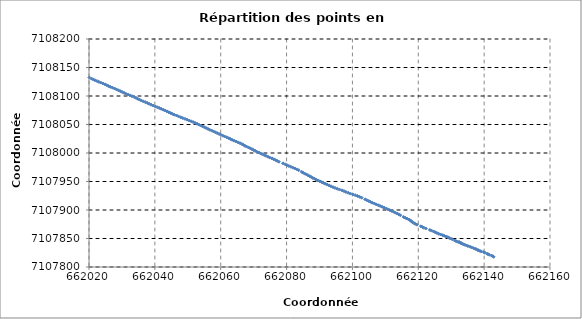
| Category | Series 0 |
|---|---|
| 662142.856 | 7107817.874 |
| 662142.643 | 7107818.833 |
| 662142.29 | 7107819.903 |
| 662141.56 | 7107821.535 |
| 662141.16 | 7107822.547 |
| 662140.993 | 7107823.148 |
| 662140.245 | 7107824.994 |
| 662139.904 | 7107826.148 |
| 662139.126 | 7107827.382 |
| 662138.732 | 7107828.174 |
| 662138.262 | 7107829.174 |
| 662138.087 | 7107829.929 |
| 662137.581 | 7107831.026 |
| 662137.343 | 7107832.045 |
| 662136.74 | 7107833.074 |
| 662136.164 | 7107834.523 |
| 662135.696 | 7107835.626 |
| 662135.075 | 7107836.66 |
| 662134.655 | 7107837.752 |
| 662134.19 | 7107838.871 |
| 662133.732 | 7107839.896 |
| 662133.374 | 7107840.718 |
| 662133.049 | 7107841.609 |
| 662132.857 | 7107842.396 |
| 662132.733 | 7107842.859 |
| 662132.731 | 7107842.962 |
| 662132.418 | 7107843.529 |
| 662132.406 | 7107843.818 |
| 662131.921 | 7107844.379 |
| 662131.429 | 7107845.415 |
| 662131.043 | 7107846.538 |
| 662130.292 | 7107848.714 |
| 662129.821 | 7107849.905 |
| 662129.376 | 7107851.09 |
| 662128.97 | 7107852.319 |
| 662128.477 | 7107853.493 |
| 662127.912 | 7107854.671 |
| 662127.365 | 7107855.824 |
| 662126.78 | 7107857.063 |
| 662126.212 | 7107858.311 |
| 662125.649 | 7107859.601 |
| 662125.13 | 7107860.944 |
| 662124.645 | 7107862.298 |
| 662124.035 | 7107863.785 |
| 662123.491 | 7107865.133 |
| 662122.301 | 7107867.668 |
| 662121.714 | 7107868.803 |
| 662121.287 | 7107870.15 |
| 662120.759 | 7107871.486 |
| 662119.591 | 7107874.235 |
| 662119.059 | 7107875.676 |
| 662118.64 | 7107877.208 |
| 662118.204 | 7107878.703 |
| 662117.867 | 7107880.279 |
| 662117.552 | 7107881.8 |
| 662117.163 | 7107883.282 |
| 662116.613 | 7107884.838 |
| 662116.075 | 7107886.239 |
| 662115.54 | 7107887.72 |
| 662114.552 | 7107890.746 |
| 662114.077 | 7107892.261 |
| 662113.603 | 7107893.788 |
| 662113.045 | 7107895.338 |
| 662112.48 | 7107896.89 |
| 662111.885 | 7107898.384 |
| 662111.316 | 7107899.841 |
| 662110.748 | 7107901.295 |
| 662110.133 | 7107902.759 |
| 662109.619 | 7107904.177 |
| 662109.061 | 7107905.61 |
| 662108.427 | 7107906.959 |
| 662107.852 | 7107908.361 |
| 662107.201 | 7107909.865 |
| 662106.657 | 7107911.343 |
| 662106.043 | 7107912.808 |
| 662105.518 | 7107914.251 |
| 662104.946 | 7107915.747 |
| 662104.384 | 7107917.213 |
| 662103.859 | 7107918.715 |
| 662102.808 | 7107921.612 |
| 662102.183 | 7107923.055 |
| 662101.546 | 7107924.57 |
| 662100.837 | 7107926.011 |
| 662100.113 | 7107927.289 |
| 662099.374 | 7107928.732 |
| 662098.694 | 7107930.23 |
| 662098.004 | 7107931.679 |
| 662097.431 | 7107933.125 |
| 662096.834 | 7107934.542 |
| 662096.067 | 7107935.883 |
| 662095.384 | 7107937.268 |
| 662094.695 | 7107938.713 |
| 662094.094 | 7107940.137 |
| 662093.489 | 7107941.579 |
| 662092.924 | 7107943.099 |
| 662092.34 | 7107944.587 |
| 662091.795 | 7107946.079 |
| 662091.206 | 7107947.472 |
| 662090.664 | 7107948.894 |
| 662090.08 | 7107950.391 |
| 662089.499 | 7107951.84 |
| 662089.006 | 7107953.304 |
| 662088.485 | 7107954.854 |
| 662087.931 | 7107956.326 |
| 662087.487 | 7107957.836 |
| 662087.009 | 7107959.321 |
| 662086.514 | 7107960.835 |
| 662086.056 | 7107962.317 |
| 662085.535 | 7107963.801 |
| 662085.043 | 7107965.328 |
| 662084.616 | 7107966.742 |
| 662083.666 | 7107969.735 |
| 662083.216 | 7107971.194 |
| 662082.585 | 7107972.726 |
| 662081.957 | 7107974.198 |
| 662081.316 | 7107975.707 |
| 662080.691 | 7107977.209 |
| 662080.103 | 7107978.761 |
| 662079.557 | 7107980.283 |
| 662078.908 | 7107981.876 |
| 662077.656 | 7107984.717 |
| 662077.15 | 7107986.128 |
| 662076.624 | 7107987.603 |
| 662076.087 | 7107989.081 |
| 662075.531 | 7107990.573 |
| 662074.892 | 7107991.953 |
| 662074.353 | 7107993.469 |
| 662073.744 | 7107995.008 |
| 662073.209 | 7107996.504 |
| 662072.605 | 7107997.925 |
| 662072.106 | 7107999.287 |
| 662071.584 | 7108000.799 |
| 662070.965 | 7108002.302 |
| 662070.452 | 7108003.749 |
| 662069.98 | 7108005.213 |
| 662069.485 | 7108006.698 |
| 662068.978 | 7108008.264 |
| 662068.426 | 7108009.778 |
| 662067.848 | 7108011.262 |
| 662067.339 | 7108012.721 |
| 662066.903 | 7108014.221 |
| 662066.404 | 7108015.712 |
| 662065.862 | 7108017.186 |
| 662065.278 | 7108018.664 |
| 662064.677 | 7108020.171 |
| 662064.11 | 7108021.627 |
| 662063.496 | 7108023.049 |
| 662062.956 | 7108024.542 |
| 662062.403 | 7108026.053 |
| 662061.794 | 7108027.551 |
| 662061.216 | 7108028.974 |
| 662060.634 | 7108030.436 |
| 662060.034 | 7108031.901 |
| 662059.49 | 7108033.491 |
| 662058.902 | 7108034.96 |
| 662058.371 | 7108036.322 |
| 662057.814 | 7108037.803 |
| 662057.284 | 7108039.302 |
| 662056.668 | 7108040.75 |
| 662056.141 | 7108042.212 |
| 662055.584 | 7108043.751 |
| 662055.031 | 7108045.258 |
| 662054.473 | 7108046.682 |
| 662053.923 | 7108048.224 |
| 662053.365 | 7108049.765 |
| 662052.826 | 7108051.262 |
| 662052.236 | 7108052.705 |
| 662051.654 | 7108054.161 |
| 662051.043 | 7108055.605 |
| 662050.417 | 7108057 |
| 662049.774 | 7108058.469 |
| 662049.138 | 7108059.918 |
| 662048.482 | 7108061.326 |
| 662047.817 | 7108062.723 |
| 662047.153 | 7108064.291 |
| 662046.572 | 7108065.826 |
| 662045.919 | 7108067.179 |
| 662045.375 | 7108068.544 |
| 662044.776 | 7108070.019 |
| 662044.21 | 7108071.497 |
| 662043.67 | 7108073.024 |
| 662043.123 | 7108074.494 |
| 662042.573 | 7108075.959 |
| 662041.95 | 7108077.456 |
| 662041.348 | 7108078.894 |
| 662040.745 | 7108080.361 |
| 662040.114 | 7108081.721 |
| 662039.484 | 7108083.252 |
| 662038.87 | 7108084.786 |
| 662038.271 | 7108086.255 |
| 662037.72 | 7108087.743 |
| 662037.093 | 7108089.205 |
| 662036.46 | 7108090.692 |
| 662035.848 | 7108092.187 |
| 662035.296 | 7108093.711 |
| 662034.776 | 7108095.201 |
| 662034.291 | 7108096.755 |
| 662033.744 | 7108098.197 |
| 662033.062 | 7108099.622 |
| 662032.444 | 7108101.174 |
| 662031.815 | 7108102.604 |
| 662031.137 | 7108104.107 |
| 662030.63 | 7108105.579 |
| 662030.073 | 7108107.079 |
| 662029.492 | 7108108.554 |
| 662028.937 | 7108110.009 |
| 662028.344 | 7108111.491 |
| 662027.786 | 7108113.035 |
| 662027.162 | 7108114.507 |
| 662026.509 | 7108115.95 |
| 662025.893 | 7108117.403 |
| 662025.412 | 7108118.946 |
| 662024.835 | 7108120.441 |
| 662024.207 | 7108122.015 |
| 662023.551 | 7108123.576 |
| 662022.996 | 7108124.791 |
| 662022.426 | 7108126.262 |
| 662021.797 | 7108127.635 |
| 662021.263 | 7108129.11 |
| 662020.742 | 7108130.468 |
| 662020.098 | 7108132.479 |